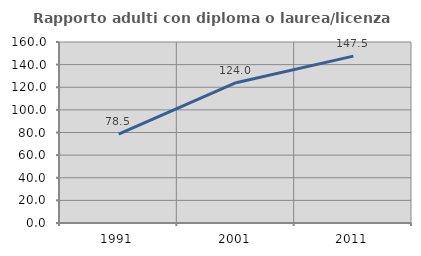
| Category | Rapporto adulti con diploma o laurea/licenza media  |
|---|---|
| 1991.0 | 78.481 |
| 2001.0 | 123.988 |
| 2011.0 | 147.541 |